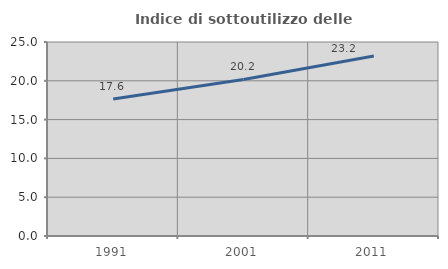
| Category | Indice di sottoutilizzo delle abitazioni  |
|---|---|
| 1991.0 | 17.641 |
| 2001.0 | 20.175 |
| 2011.0 | 23.207 |